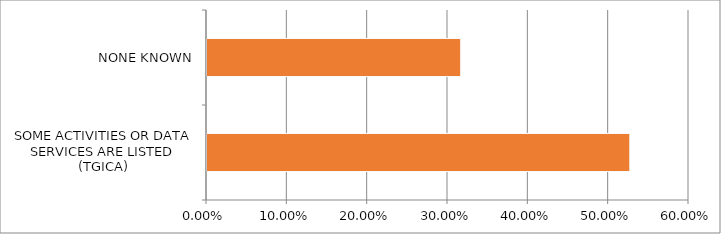
| Category | Series 0 |
|---|---|
| SOME ACTIVITIES OR DATA SERVICES ARE LISTED (TGICA) | 0.526 |
| NONE KNOWN | 0.316 |